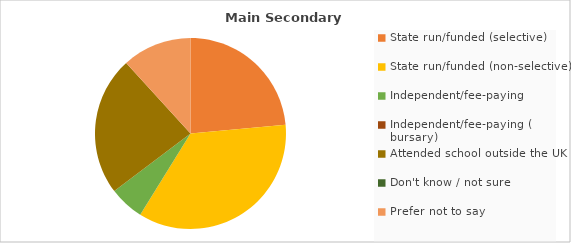
| Category | % |
|---|---|
| State run/funded (selective) | 23.529 |
| State run/funded (non-selective) | 35.294 |
| Independent/fee-paying | 5.882 |
| Independent/fee-paying ( bursary) | 0 |
| Attended school outside the UK | 23.529 |
| Don't know / not sure | 0 |
| Prefer not to say | 11.765 |